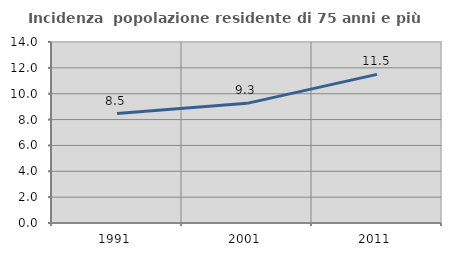
| Category | Incidenza  popolazione residente di 75 anni e più |
|---|---|
| 1991.0 | 8.468 |
| 2001.0 | 9.254 |
| 2011.0 | 11.493 |